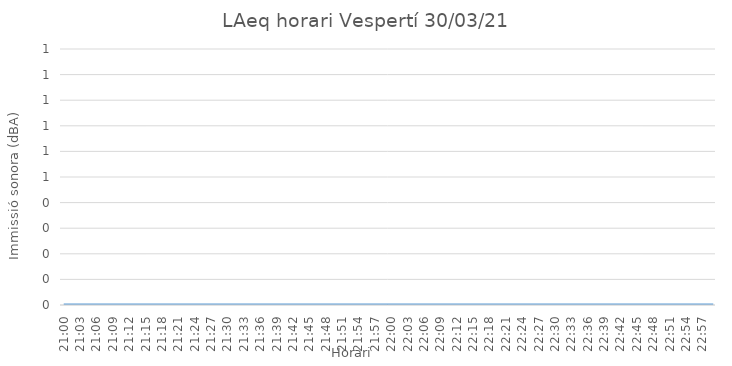
| Category | LAeq horari Vespertí 30/03/21 |
|---|---|
| 21:00 | 0 |
| 21:01 | 0 |
| 21:02 | 0 |
| 21:03 | 0 |
| 21:04 | 0 |
| 21:05 | 0 |
| 21:06 | 0 |
| 21:07 | 0 |
| 21:08 | 0 |
| 21:09 | 0 |
| 21:10 | 0 |
| 21:11 | 0 |
| 21:12 | 0 |
| 21:13 | 0 |
| 21:14 | 0 |
| 21:15 | 0 |
| 21:16 | 0 |
| 21:17 | 0 |
| 21:18 | 0 |
| 21:19 | 0 |
| 21:20 | 0 |
| 21:21 | 0 |
| 21:22 | 0 |
| 21:23 | 0 |
| 21:24 | 0 |
| 21:25 | 0 |
| 21:26 | 0 |
| 21:27 | 0 |
| 21:28 | 0 |
| 21:29 | 0 |
| 21:30 | 0 |
| 21:31 | 0 |
| 21:32 | 0 |
| 21:33 | 0 |
| 21:34 | 0 |
| 21:35 | 0 |
| 21:36 | 0 |
| 21:37 | 0 |
| 21:38 | 0 |
| 21:39 | 0 |
| 21:40 | 0 |
| 21:41 | 0 |
| 21:42 | 0 |
| 21:43 | 0 |
| 21:44 | 0 |
| 21:45 | 0 |
| 21:46 | 0 |
| 21:47 | 0 |
| 21:48 | 0 |
| 21:49 | 0 |
| 21:50 | 0 |
| 21:51 | 0 |
| 21:52 | 0 |
| 21:53 | 0 |
| 21:54 | 0 |
| 21:55 | 0 |
| 21:56 | 0 |
| 21:57 | 0 |
| 21:58 | 0 |
| 21:59 | 0 |
| 22:00 | 0 |
| 22:01 | 0 |
| 22:02 | 0 |
| 22:03 | 0 |
| 22:04 | 0 |
| 22:05 | 0 |
| 22:06 | 0 |
| 22:07 | 0 |
| 22:08 | 0 |
| 22:09 | 0 |
| 22:10 | 0 |
| 22:11 | 0 |
| 22:12 | 0 |
| 22:13 | 0 |
| 22:14 | 0 |
| 22:15 | 0 |
| 22:16 | 0 |
| 22:17 | 0 |
| 22:18 | 0 |
| 22:19 | 0 |
| 22:20 | 0 |
| 22:21 | 0 |
| 22:22 | 0 |
| 22:23 | 0 |
| 22:24 | 0 |
| 22:25 | 0 |
| 22:26 | 0 |
| 22:27 | 0 |
| 22:28 | 0 |
| 22:29 | 0 |
| 22:30 | 0 |
| 22:31 | 0 |
| 22:32 | 0 |
| 22:33 | 0 |
| 22:34 | 0 |
| 22:35 | 0 |
| 22:36 | 0 |
| 22:37 | 0 |
| 22:38 | 0 |
| 22:39 | 0 |
| 22:40 | 0 |
| 22:41 | 0 |
| 22:42 | 0 |
| 22:43 | 0 |
| 22:44 | 0 |
| 22:45 | 0 |
| 22:46 | 0 |
| 22:47 | 0 |
| 22:48 | 0 |
| 22:49 | 0 |
| 22:50 | 0 |
| 22:51 | 0 |
| 22:52 | 0 |
| 22:53 | 0 |
| 22:54 | 0 |
| 22:55 | 0 |
| 22:56 | 0 |
| 22:57 | 0 |
| 22:58 | 0 |
| 22:59 | 0 |